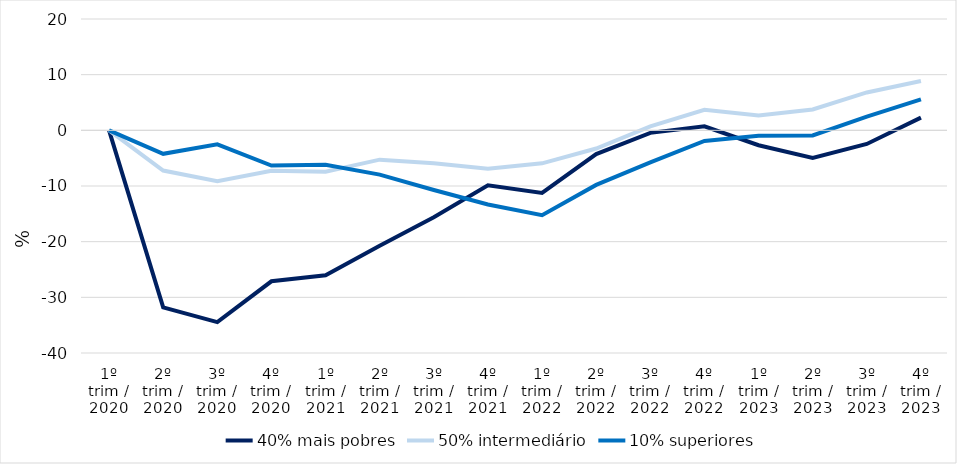
| Category | 40% mais pobres | 50% intermediário | 10% superiores |
|---|---|---|---|
| 1º trim / 2020 | 0 | 0 | 0 |
| 2º trim / 2020 | -31.802 | -7.229 | -4.219 |
| 3º trim / 2020 | -34.442 | -9.134 | -2.519 |
| 4º trim / 2020 | -27.118 | -7.257 | -6.317 |
| 1º trim / 2021 | -26.034 | -7.441 | -6.204 |
| 2º trim / 2021 | -20.744 | -5.27 | -7.957 |
| 3º trim / 2021 | -15.624 | -5.899 | -10.723 |
| 4º trim / 2021 | -9.863 | -6.888 | -13.319 |
| 1º trim / 2022 | -11.232 | -5.934 | -15.236 |
| 2º trim / 2022 | -4.272 | -3.27 | -9.802 |
| 3º trim / 2022 | -0.453 | 0.707 | -5.74 |
| 4º trim / 2022 | 0.724 | 3.685 | -1.913 |
| 1º trim / 2023 | -2.681 | 2.683 | -0.963 |
| 2º trim / 2023 | -4.942 | 3.745 | -0.912 |
| 3º trim / 2023 | -2.445 | 6.808 | 2.461 |
| 4º trim / 2023 | 2.279 | 8.853 | 5.552 |